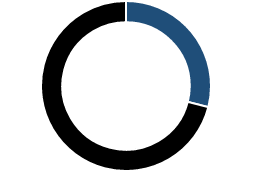
| Category | Series 0 |
|---|---|
| 0 | 0.29 |
| 1 | 0.71 |